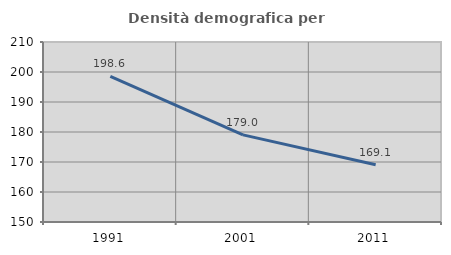
| Category | Densità demografica |
|---|---|
| 1991.0 | 198.582 |
| 2001.0 | 179.04 |
| 2011.0 | 169.086 |